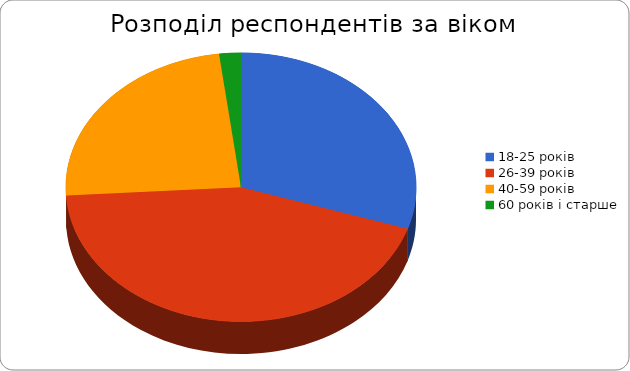
| Category | Series 0 |
|---|---|
| 18-25 років | 15 |
| 26-39 років | 22 |
| 40-59 років | 12 |
| 60 років і старше | 1 |